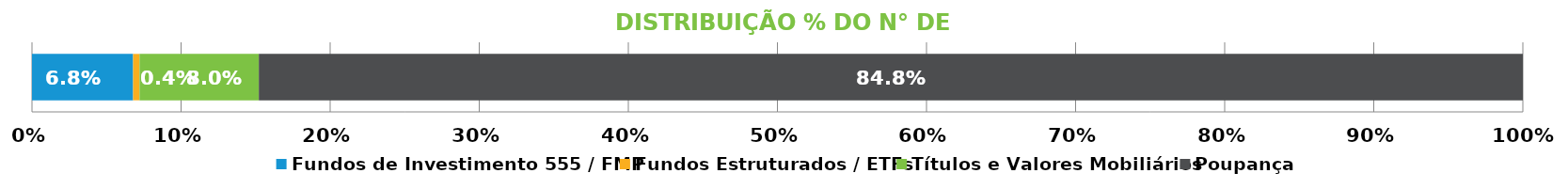
| Category | Fundos de Investimento 555 / FMP | Fundos Estruturados / ETFs | Títulos e Valores Mobiliários | Poupança |
|---|---|---|---|---|
| 0 | 0.068 | 0.004 | 0.08 | 0.848 |